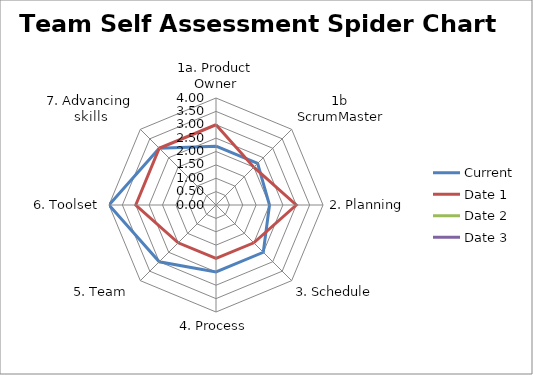
| Category | Current | Date 1 | Date 2 | Date 3 |
|---|---|---|---|---|
| 1a. Product Owner | 2.2 | 3 | 0 | 0 |
| 1b  ScrumMaster | 2.2 | 2 | 0 | 0 |
| 2. Planning | 2 | 3 | 0 | 0 |
| 3. Schedule | 2.5 | 2 | 0 | 0 |
| 4. Process | 2.5 | 2 | 0 | 0 |
| 5. Team  | 3 | 2 | 0 | 0 |
| 6. Toolset | 4 | 3 | 0 | 0 |
| 7. Advancing skills | 3 | 3 | 0 | 0 |